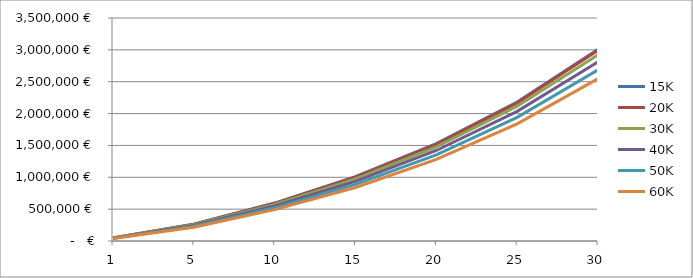
| Category | 15K | 20K | 30K | 40K | 50K | 60K |
|---|---|---|---|---|---|---|
| 1.0 | 47679 | 47183 | 45707.16 | 43625.32 | 41252.46 | 38756.54 |
| 5.0 | 265056.228 | 262530.905 | 254759.416 | 243580.122 | 230764.296 | 217256.449 |
| 10.0 | 595443.057 | 590341.016 | 573948.101 | 549803.796 | 521937.033 | 492496.201 |
| 15.0 | 1008526.05 | 1000692.071 | 974433.63 | 934910.823 | 889018.055 | 840431.701 |
| 20.0 | 1527624.106 | 1516770.286 | 1478885.491 | 1420739.133 | 1352862.544 | 1280871.454 |
| 25.0 | 2182155.986 | 2167841.359 | 2115944.222 | 2034904.522 | 1939869.658 | 1838916.834 |
| 30.0 | 3009312.596 | 2990914.682 | 2921851.252 | 2812373.292 | 2683487.021 | 2546393.8 |